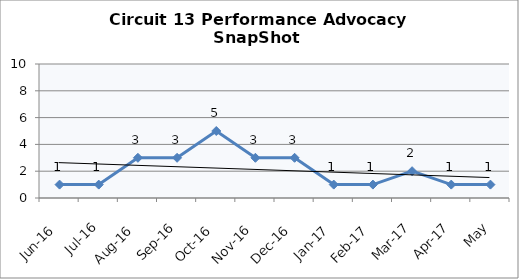
| Category | Circuit 13 |
|---|---|
| Jun-16 | 1 |
| Jul-16 | 1 |
| Aug-16 | 3 |
| Sep-16 | 3 |
| Oct-16 | 5 |
| Nov-16 | 3 |
| Dec-16 | 3 |
| Jan-17 | 1 |
| Feb-17 | 1 |
| Mar-17 | 2 |
| Apr-17 | 1 |
| May | 1 |